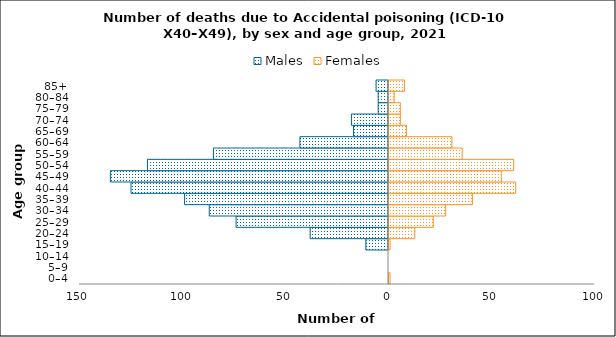
| Category | Males | Females |
|---|---|---|
| 0–4 | 0 | 1 |
| 5–9 | 0 | 0 |
| 10–14 | 0 | 0 |
| 15–19 | -11 | 1 |
| 20–24 | -38 | 13 |
| 25–29 | -74 | 22 |
| 30–34 | -87 | 28 |
| 35–39 | -99 | 41 |
| 40–44 | -125 | 62 |
| 45–49 | -135 | 55 |
| 50–54 | -117 | 61 |
| 55–59 | -85 | 36 |
| 60–64 | -43 | 31 |
| 65–69 | -17 | 9 |
| 70–74 | -18 | 6 |
| 75–79 | -5 | 6 |
| 80–84 | -5 | 3 |
| 85+ | -6 | 8 |